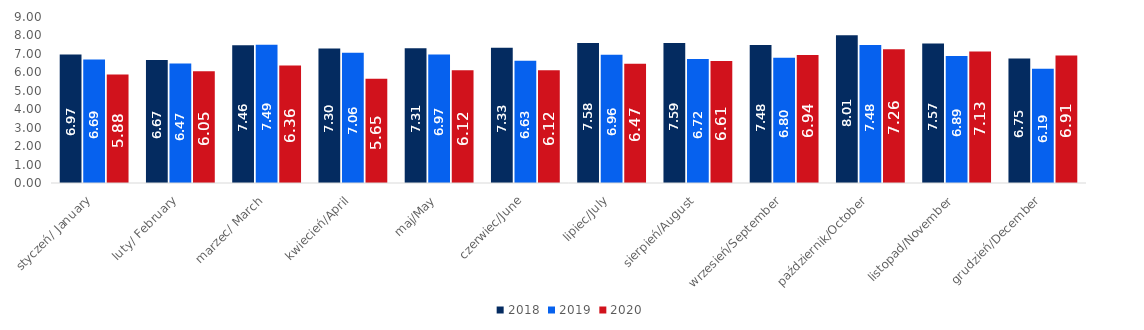
| Category | 2018 | 2019 | 2020 |
|---|---|---|---|
| styczeń/ January | 6.97 | 6.694 | 5.885 |
| luty/ February | 6.67 | 6.473 | 6.053 |
| marzec/ March | 7.462 | 7.492 | 6.364 |
| kwiecień/April | 7.296 | 7.059 | 5.647 |
| maj/May | 7.312 | 6.965 | 6.119 |
| czerwiec/June | 7.327 | 6.628 | 6.117 |
| lipiec/July | 7.584 | 6.96 | 6.471 |
| sierpień/August | 7.587 | 6.72 | 6.608 |
| wrzesień/September | 7.476 | 6.796 | 6.94 |
| październik/October | 8.009 | 7.475 | 7.258 |
| listopad/November | 7.569 | 6.887 | 7.13 |
| grudzień/December | 6.748 | 6.194 | 6.909 |